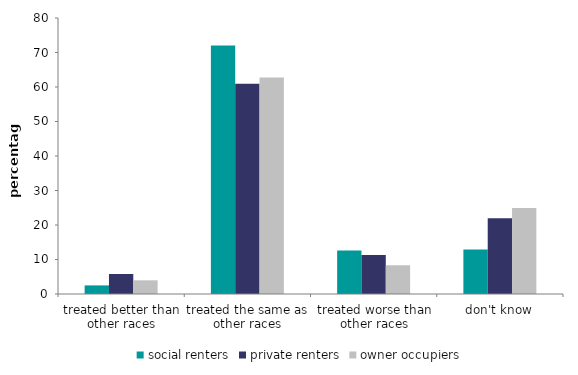
| Category | social renters | private renters | owner occupiers |
|---|---|---|---|
| treated better than other races | 2.494 | 5.804 | 3.961 |
| treated the same as other races | 72.042 | 60.932 | 62.768 |
| treated worse than other races | 12.583 | 11.328 | 8.332 |
| don't know | 12.881 | 21.936 | 24.94 |